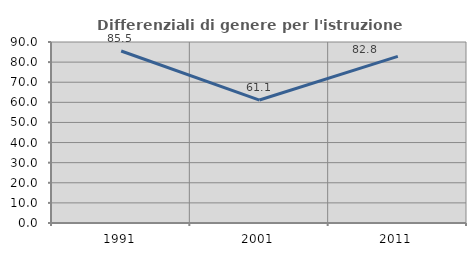
| Category | Differenziali di genere per l'istruzione superiore |
|---|---|
| 1991.0 | 85.506 |
| 2001.0 | 61.139 |
| 2011.0 | 82.84 |